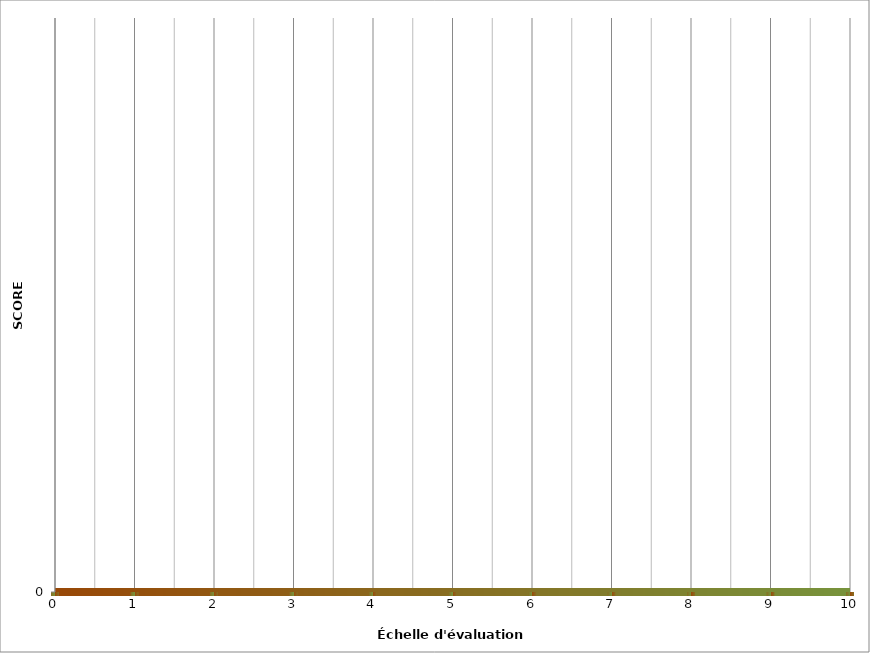
| Category | Series 0 |
|---|---|
| #N/A | 0 |
| #N/A | 0 |
| #N/A | 0 |
| #N/A | 0 |
| #N/A | 0 |
| #N/A | 0 |
| #N/A | 0 |
| #N/A | 0 |
| #N/A | 0 |
| #N/A | 0 |
| #N/A | 0 |
| #N/A | 0 |
| #N/A | 0 |
| #N/A | 0 |
| #N/A | 0 |
| #N/A | 0 |
| #N/A | 0 |
| #N/A | 0 |
| #N/A | 0 |
| #N/A | 0 |
| #N/A | 0 |
| #N/A | 0 |
| #N/A | 0 |
| #N/A | 0 |
| #N/A | 0 |
| #N/A | 0 |
| #N/A | 0 |
| #N/A | 0 |
| #N/A | 0 |
| #N/A | 0 |
| #N/A | 0 |
| #N/A | 0 |
| #N/A | 0 |
| #N/A | 0 |
| #N/A | 0 |
| #N/A | 0 |
| #N/A | 0 |
| #N/A | 0 |
| #N/A | 0 |